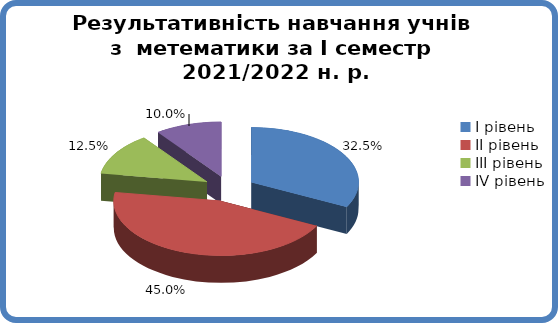
| Category | Series 0 |
|---|---|
| 0 | 0.325 |
| 1 | 0.45 |
| 2 | 0.125 |
| 3 | 0.1 |